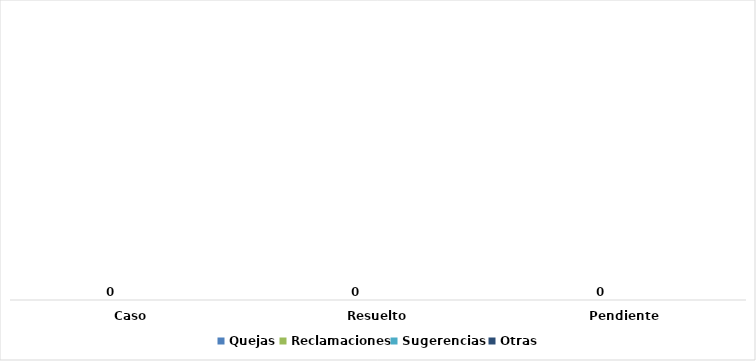
| Category | Quejas | Reclamaciones | Sugerencias  | Otras |
|---|---|---|---|---|
| Caso | 0 | 0 | 0 | 0 |
| Resuelto | 0 | 0 | 0 | 0 |
| Pendiente  | 0 | 0 | 0 | 0 |